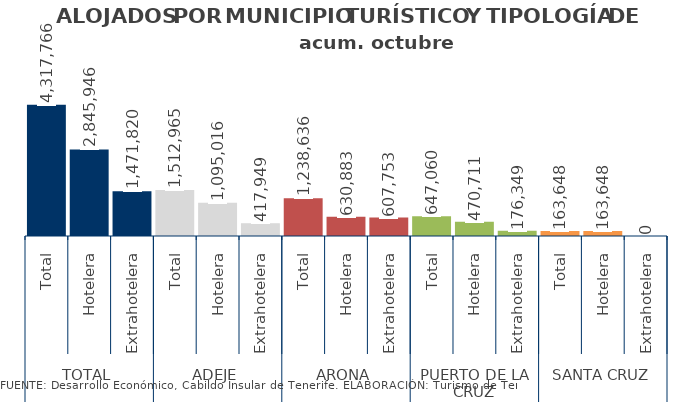
| Category | acum. octubre 2014 |
|---|---|
| 0 | 4317766 |
| 1 | 2845946 |
| 2 | 1471820 |
| 3 | 1512965 |
| 4 | 1095016 |
| 5 | 417949 |
| 6 | 1238636 |
| 7 | 630883 |
| 8 | 607753 |
| 9 | 647060 |
| 10 | 470711 |
| 11 | 176349 |
| 12 | 163648 |
| 13 | 163648 |
| 14 | 0 |